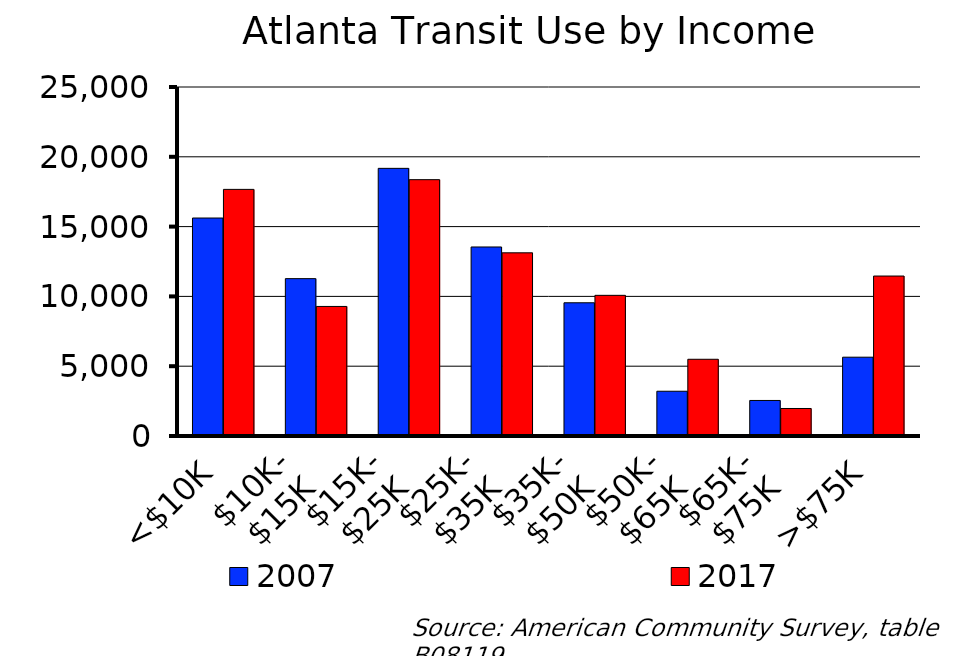
| Category | 2007 | 2017 |
|---|---|---|
| <$10K | 15614 | 17666 |
| $10K-
$15K | 11273 | 9280 |
| $15K-
$25K | 19172 | 18362 |
| $25K-
$35K | 13540 | 13122 |
| $35K-
$50K | 9543 | 10076 |
| $50K-
$65K | 3206 | 5496 |
| $65K-
$75K | 2546 | 1971 |
| >$75K | 5645 | 11458 |